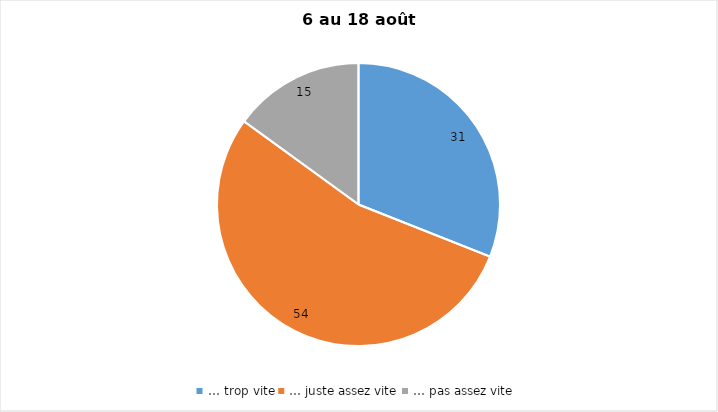
| Category | Series 0 |
|---|---|
| … trop vite | 31 |
| … juste assez vite | 54 |
| … pas assez vite | 15 |